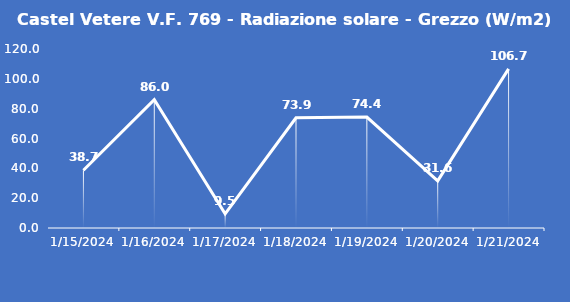
| Category | Castel Vetere V.F. 769 - Radiazione solare - Grezzo (W/m2) |
|---|---|
| 1/15/24 | 38.7 |
| 1/16/24 | 86 |
| 1/17/24 | 9.5 |
| 1/18/24 | 73.9 |
| 1/19/24 | 74.4 |
| 1/20/24 | 31.6 |
| 1/21/24 | 106.7 |